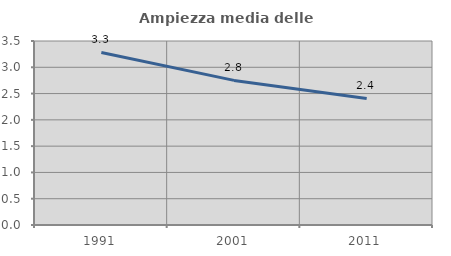
| Category | Ampiezza media delle famiglie |
|---|---|
| 1991.0 | 3.282 |
| 2001.0 | 2.751 |
| 2011.0 | 2.407 |